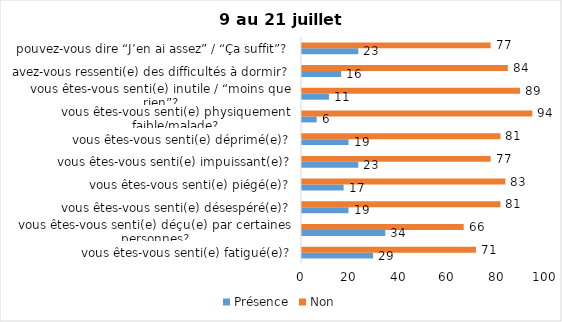
| Category | Présence | Non |
|---|---|---|
| vous êtes-vous senti(e) fatigué(e)? | 29 | 71 |
| vous êtes-vous senti(e) déçu(e) par certaines personnes? | 34 | 66 |
| vous êtes-vous senti(e) désespéré(e)? | 19 | 81 |
| vous êtes-vous senti(e) piégé(e)? | 17 | 83 |
| vous êtes-vous senti(e) impuissant(e)? | 23 | 77 |
| vous êtes-vous senti(e) déprimé(e)? | 19 | 81 |
| vous êtes-vous senti(e) physiquement faible/malade? | 6 | 94 |
| vous êtes-vous senti(e) inutile / “moins que rien”? | 11 | 89 |
| avez-vous ressenti(e) des difficultés à dormir? | 16 | 84 |
| pouvez-vous dire “J’en ai assez” / “Ça suffit”? | 23 | 77 |